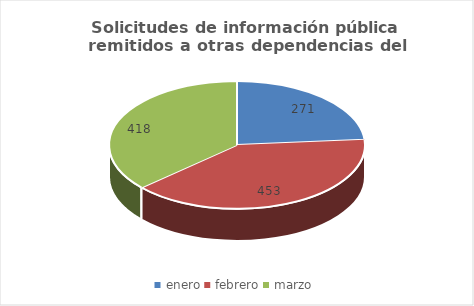
| Category | Series 0 |
|---|---|
| enero | 271 |
| febrero | 453 |
| marzo | 418 |